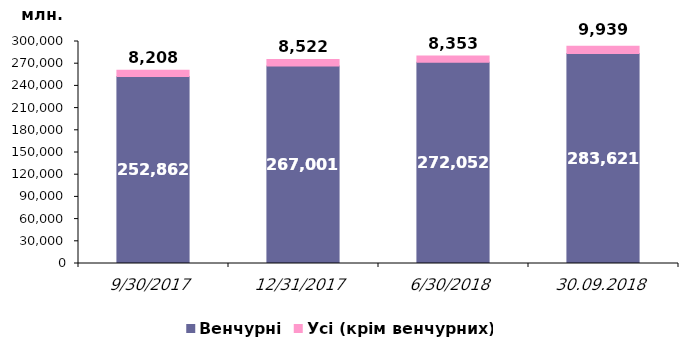
| Category | Венчурні | Усі (крім венчурних) |
|---|---|---|
| 30.09.2017 | 252862.417 | 8207.603 |
| 31.12.2017 | 267000.791 | 8521.52 |
| 30.06.2018 | 272052.334 | 8352.685 |
| 30.09.2018 | 283620.683 | 9938.915 |